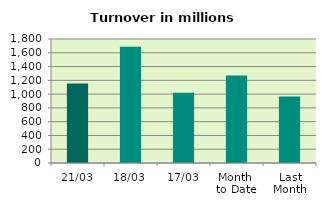
| Category | Series 0 |
|---|---|
| 21/03 | 1154.967 |
| 18/03 | 1687.145 |
| 17/03 | 1021.101 |
| Month 
to Date | 1271.973 |
| Last
Month | 966.674 |